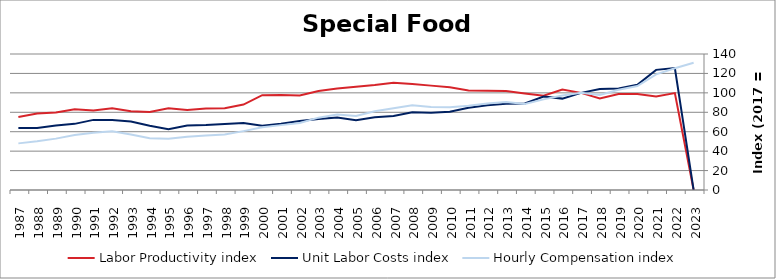
| Category | Labor Productivity index | Unit Labor Costs index | Hourly Compensation index |
|---|---|---|---|
| 2023.0 | 0 | 0 | 130.942 |
| 2022.0 | 99.749 | 125.57 | 125.255 |
| 2021.0 | 96.291 | 123.67 | 119.084 |
| 2020.0 | 98.828 | 108.275 | 107.006 |
| 2019.0 | 98.875 | 104.432 | 103.257 |
| 2018.0 | 94.222 | 103.925 | 97.92 |
| 2017.0 | 100 | 100 | 100 |
| 2016.0 | 103.422 | 94.076 | 97.295 |
| 2015.0 | 96.952 | 96.209 | 93.277 |
| 2014.0 | 99.432 | 88.993 | 88.488 |
| 2013.0 | 101.954 | 88.727 | 90.46 |
| 2012.0 | 102.085 | 87.315 | 89.135 |
| 2011.0 | 102.469 | 84.682 | 86.773 |
| 2010.0 | 105.69 | 80.502 | 85.082 |
| 2009.0 | 107.449 | 79.561 | 85.487 |
| 2008.0 | 109.097 | 80.053 | 87.336 |
| 2007.0 | 110.501 | 76.179 | 84.179 |
| 2006.0 | 108.195 | 74.846 | 80.98 |
| 2005.0 | 106.398 | 71.708 | 76.296 |
| 2004.0 | 104.403 | 74.547 | 77.829 |
| 2003.0 | 101.851 | 73.135 | 74.488 |
| 2002.0 | 97.284 | 70.908 | 68.982 |
| 2001.0 | 97.839 | 68.254 | 66.779 |
| 2000.0 | 97.664 | 66.069 | 64.526 |
| 1999.0 | 87.934 | 68.908 | 60.593 |
| 1998.0 | 84.099 | 67.867 | 57.075 |
| 1997.0 | 83.916 | 66.871 | 56.116 |
| 1996.0 | 82.329 | 66.506 | 54.754 |
| 1995.0 | 84.233 | 62.678 | 52.796 |
| 1994.0 | 80.39 | 66.183 | 53.205 |
| 1993.0 | 81.122 | 70.474 | 57.17 |
| 1992.0 | 84.12 | 71.984 | 60.553 |
| 1991.0 | 81.738 | 72.184 | 59.001 |
| 1990.0 | 83.033 | 68.087 | 56.535 |
| 1989.0 | 79.694 | 66.37 | 52.893 |
| 1988.0 | 78.787 | 63.749 | 50.226 |
| 1987.0 | 75.087 | 63.925 | 48 |